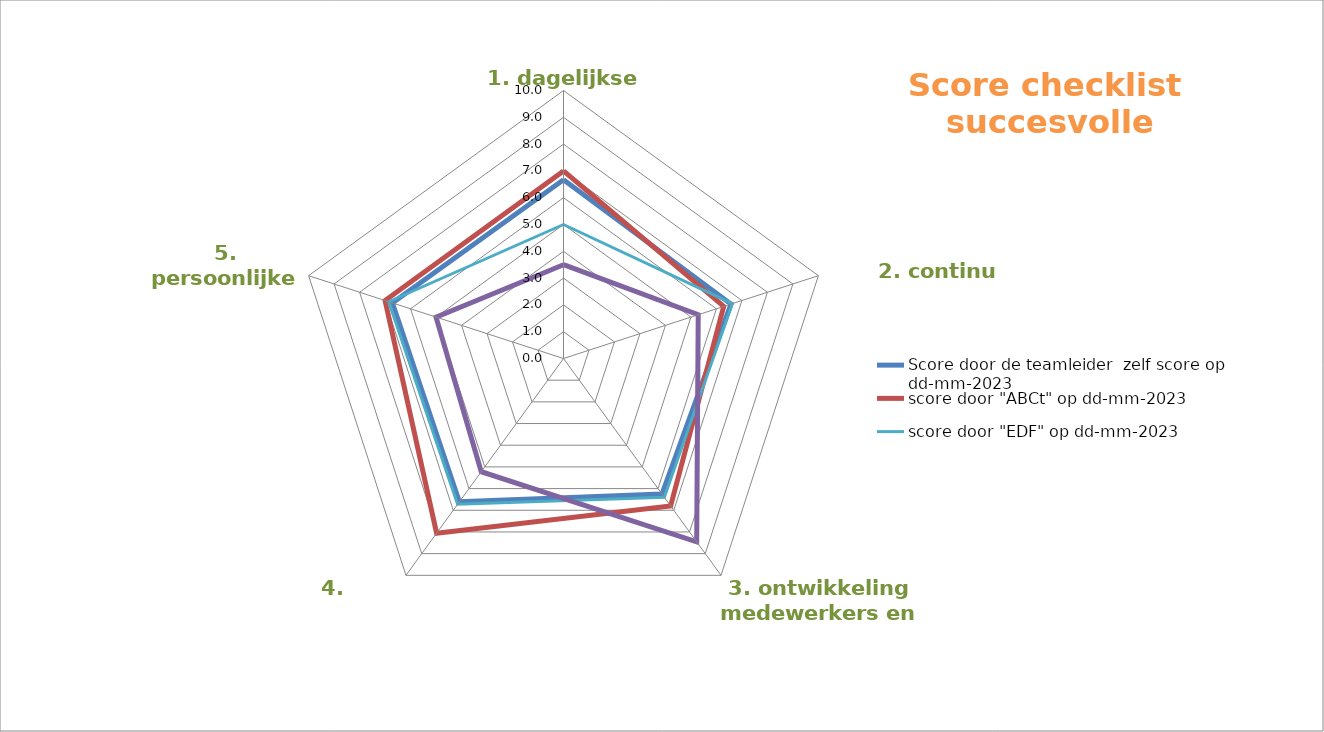
| Category | Score door de teamleider  zelf score op dd-mm-2023 | score door "ABCt" op dd-mm-2023 | score door "EDF" op dd-mm-2023 | score door leidinggevende "XYZ"  op dd-mm-2023 |
|---|---|---|---|---|
| 1. dagelijkse operatie | 6.667 | 7 | 5 | 3.5 |
| 2. continu verbeteren | 6.571 | 6.286 | 6.625 | 5.286 |
| 3. ontwikkeling medewerkers en team | 6.25 | 6.8 | 6.4 | 8.455 |
| 4. vaardigheden | 6.611 | 8.056 | 6.722 | 5.222 |
| 5. persoonlijke kenmerken | 6.714 | 7 | 6.857 | 5 |